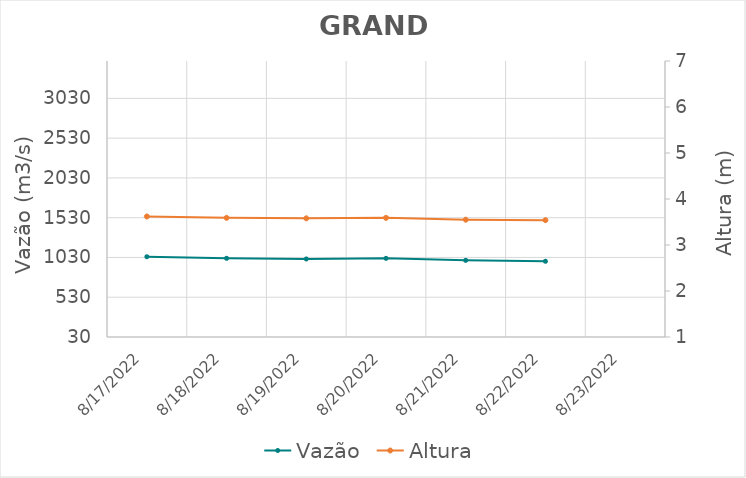
| Category | Vazão |
|---|---|
| 4/26/22 | 3205.71 |
| 4/25/22 | 3076.9 |
| 4/24/22 | 3022.48 |
| 4/23/22 | 2956.02 |
| 4/22/22 | 2862.73 |
| 4/21/22 | 2621.07 |
| 4/20/22 | 2679.31 |